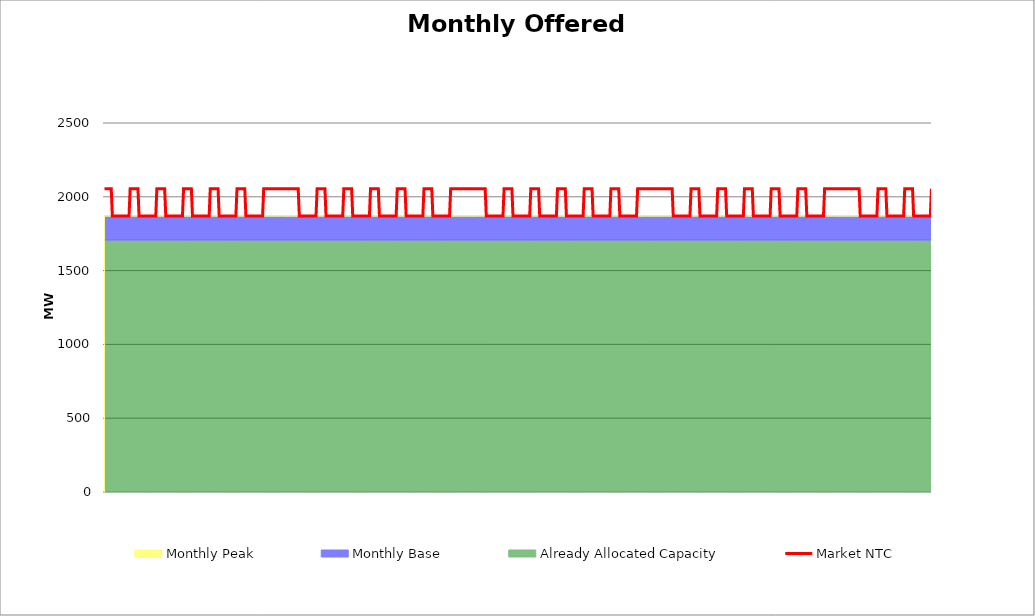
| Category | Market NTC |
|---|---|
| 0 | 2055 |
| 1 | 2055 |
| 2 | 2055 |
| 3 | 2055 |
| 4 | 2055 |
| 5 | 2055 |
| 6 | 2055 |
| 7 | 1870 |
| 8 | 1870 |
| 9 | 1870 |
| 10 | 1870 |
| 11 | 1870 |
| 12 | 1870 |
| 13 | 1870 |
| 14 | 1870 |
| 15 | 1870 |
| 16 | 1870 |
| 17 | 1870 |
| 18 | 1870 |
| 19 | 1870 |
| 20 | 1870 |
| 21 | 1870 |
| 22 | 1870 |
| 23 | 2055 |
| 24 | 2055 |
| 25 | 2055 |
| 26 | 2055 |
| 27 | 2055 |
| 28 | 2055 |
| 29 | 2055 |
| 30 | 2055 |
| 31 | 1870 |
| 32 | 1870 |
| 33 | 1870 |
| 34 | 1870 |
| 35 | 1870 |
| 36 | 1870 |
| 37 | 1870 |
| 38 | 1870 |
| 39 | 1870 |
| 40 | 1870 |
| 41 | 1870 |
| 42 | 1870 |
| 43 | 1870 |
| 44 | 1870 |
| 45 | 1870 |
| 46 | 1870 |
| 47 | 2055 |
| 48 | 2055 |
| 49 | 2055 |
| 50 | 2055 |
| 51 | 2055 |
| 52 | 2055 |
| 53 | 2055 |
| 54 | 2055 |
| 55 | 1870 |
| 56 | 1870 |
| 57 | 1870 |
| 58 | 1870 |
| 59 | 1870 |
| 60 | 1870 |
| 61 | 1870 |
| 62 | 1870 |
| 63 | 1870 |
| 64 | 1870 |
| 65 | 1870 |
| 66 | 1870 |
| 67 | 1870 |
| 68 | 1870 |
| 69 | 1870 |
| 70 | 1870 |
| 71 | 2055 |
| 72 | 2055 |
| 73 | 2055 |
| 74 | 2055 |
| 75 | 2055 |
| 76 | 2055 |
| 77 | 2055 |
| 78 | 2055 |
| 79 | 1870 |
| 80 | 1870 |
| 81 | 1870 |
| 82 | 1870 |
| 83 | 1870 |
| 84 | 1870 |
| 85 | 1870 |
| 86 | 1870 |
| 87 | 1870 |
| 88 | 1870 |
| 89 | 1870 |
| 90 | 1870 |
| 91 | 1870 |
| 92 | 1870 |
| 93 | 1870 |
| 94 | 1870 |
| 95 | 2055 |
| 96 | 2055 |
| 97 | 2055 |
| 98 | 2055 |
| 99 | 2055 |
| 100 | 2055 |
| 101 | 2055 |
| 102 | 2055 |
| 103 | 1870 |
| 104 | 1870 |
| 105 | 1870 |
| 106 | 1870 |
| 107 | 1870 |
| 108 | 1870 |
| 109 | 1870 |
| 110 | 1870 |
| 111 | 1870 |
| 112 | 1870 |
| 113 | 1870 |
| 114 | 1870 |
| 115 | 1870 |
| 116 | 1870 |
| 117 | 1870 |
| 118 | 1870 |
| 119 | 2055 |
| 120 | 2055 |
| 121 | 2055 |
| 122 | 2055 |
| 123 | 2055 |
| 124 | 2055 |
| 125 | 2055 |
| 126 | 2055 |
| 127 | 1870 |
| 128 | 1870 |
| 129 | 1870 |
| 130 | 1870 |
| 131 | 1870 |
| 132 | 1870 |
| 133 | 1870 |
| 134 | 1870 |
| 135 | 1870 |
| 136 | 1870 |
| 137 | 1870 |
| 138 | 1870 |
| 139 | 1870 |
| 140 | 1870 |
| 141 | 1870 |
| 142 | 1870 |
| 143 | 2055 |
| 144 | 2055 |
| 145 | 2055 |
| 146 | 2055 |
| 147 | 2055 |
| 148 | 2055 |
| 149 | 2055 |
| 150 | 2055 |
| 151 | 2055 |
| 152 | 2055 |
| 153 | 2055 |
| 154 | 2055 |
| 155 | 2055 |
| 156 | 2055 |
| 157 | 2055 |
| 158 | 2055 |
| 159 | 2055 |
| 160 | 2055 |
| 161 | 2055 |
| 162 | 2055 |
| 163 | 2055 |
| 164 | 2055 |
| 165 | 2055 |
| 166 | 2055 |
| 167 | 2055 |
| 168 | 2055 |
| 169 | 2055 |
| 170 | 2055 |
| 171 | 2055 |
| 172 | 2055 |
| 173 | 2055 |
| 174 | 2055 |
| 175 | 1870 |
| 176 | 1870 |
| 177 | 1870 |
| 178 | 1870 |
| 179 | 1870 |
| 180 | 1870 |
| 181 | 1870 |
| 182 | 1870 |
| 183 | 1870 |
| 184 | 1870 |
| 185 | 1870 |
| 186 | 1870 |
| 187 | 1870 |
| 188 | 1870 |
| 189 | 1870 |
| 190 | 1870 |
| 191 | 2055 |
| 192 | 2055 |
| 193 | 2055 |
| 194 | 2055 |
| 195 | 2055 |
| 196 | 2055 |
| 197 | 2055 |
| 198 | 2055 |
| 199 | 1870 |
| 200 | 1870 |
| 201 | 1870 |
| 202 | 1870 |
| 203 | 1870 |
| 204 | 1870 |
| 205 | 1870 |
| 206 | 1870 |
| 207 | 1870 |
| 208 | 1870 |
| 209 | 1870 |
| 210 | 1870 |
| 211 | 1870 |
| 212 | 1870 |
| 213 | 1870 |
| 214 | 1870 |
| 215 | 2055 |
| 216 | 2055 |
| 217 | 2055 |
| 218 | 2055 |
| 219 | 2055 |
| 220 | 2055 |
| 221 | 2055 |
| 222 | 2055 |
| 223 | 1870 |
| 224 | 1870 |
| 225 | 1870 |
| 226 | 1870 |
| 227 | 1870 |
| 228 | 1870 |
| 229 | 1870 |
| 230 | 1870 |
| 231 | 1870 |
| 232 | 1870 |
| 233 | 1870 |
| 234 | 1870 |
| 235 | 1870 |
| 236 | 1870 |
| 237 | 1870 |
| 238 | 1870 |
| 239 | 2055 |
| 240 | 2055 |
| 241 | 2055 |
| 242 | 2055 |
| 243 | 2055 |
| 244 | 2055 |
| 245 | 2055 |
| 246 | 2055 |
| 247 | 1870 |
| 248 | 1870 |
| 249 | 1870 |
| 250 | 1870 |
| 251 | 1870 |
| 252 | 1870 |
| 253 | 1870 |
| 254 | 1870 |
| 255 | 1870 |
| 256 | 1870 |
| 257 | 1870 |
| 258 | 1870 |
| 259 | 1870 |
| 260 | 1870 |
| 261 | 1870 |
| 262 | 1870 |
| 263 | 2055 |
| 264 | 2055 |
| 265 | 2055 |
| 266 | 2055 |
| 267 | 2055 |
| 268 | 2055 |
| 269 | 2055 |
| 270 | 2055 |
| 271 | 1870 |
| 272 | 1870 |
| 273 | 1870 |
| 274 | 1870 |
| 275 | 1870 |
| 276 | 1870 |
| 277 | 1870 |
| 278 | 1870 |
| 279 | 1870 |
| 280 | 1870 |
| 281 | 1870 |
| 282 | 1870 |
| 283 | 1870 |
| 284 | 1870 |
| 285 | 1870 |
| 286 | 1870 |
| 287 | 2055 |
| 288 | 2055 |
| 289 | 2055 |
| 290 | 2055 |
| 291 | 2055 |
| 292 | 2055 |
| 293 | 2055 |
| 294 | 2055 |
| 295 | 1870 |
| 296 | 1870 |
| 297 | 1870 |
| 298 | 1870 |
| 299 | 1870 |
| 300 | 1870 |
| 301 | 1870 |
| 302 | 1870 |
| 303 | 1870 |
| 304 | 1870 |
| 305 | 1870 |
| 306 | 1870 |
| 307 | 1870 |
| 308 | 1870 |
| 309 | 1870 |
| 310 | 1870 |
| 311 | 2055 |
| 312 | 2055 |
| 313 | 2055 |
| 314 | 2055 |
| 315 | 2055 |
| 316 | 2055 |
| 317 | 2055 |
| 318 | 2055 |
| 319 | 2055 |
| 320 | 2055 |
| 321 | 2055 |
| 322 | 2055 |
| 323 | 2055 |
| 324 | 2055 |
| 325 | 2055 |
| 326 | 2055 |
| 327 | 2055 |
| 328 | 2055 |
| 329 | 2055 |
| 330 | 2055 |
| 331 | 2055 |
| 332 | 2055 |
| 333 | 2055 |
| 334 | 2055 |
| 335 | 2055 |
| 336 | 2055 |
| 337 | 2055 |
| 338 | 2055 |
| 339 | 2055 |
| 340 | 2055 |
| 341 | 2055 |
| 342 | 2055 |
| 343 | 1870 |
| 344 | 1870 |
| 345 | 1870 |
| 346 | 1870 |
| 347 | 1870 |
| 348 | 1870 |
| 349 | 1870 |
| 350 | 1870 |
| 351 | 1870 |
| 352 | 1870 |
| 353 | 1870 |
| 354 | 1870 |
| 355 | 1870 |
| 356 | 1870 |
| 357 | 1870 |
| 358 | 1870 |
| 359 | 2055 |
| 360 | 2055 |
| 361 | 2055 |
| 362 | 2055 |
| 363 | 2055 |
| 364 | 2055 |
| 365 | 2055 |
| 366 | 2055 |
| 367 | 1870 |
| 368 | 1870 |
| 369 | 1870 |
| 370 | 1870 |
| 371 | 1870 |
| 372 | 1870 |
| 373 | 1870 |
| 374 | 1870 |
| 375 | 1870 |
| 376 | 1870 |
| 377 | 1870 |
| 378 | 1870 |
| 379 | 1870 |
| 380 | 1870 |
| 381 | 1870 |
| 382 | 1870 |
| 383 | 2055 |
| 384 | 2055 |
| 385 | 2055 |
| 386 | 2055 |
| 387 | 2055 |
| 388 | 2055 |
| 389 | 2055 |
| 390 | 2055 |
| 391 | 1870 |
| 392 | 1870 |
| 393 | 1870 |
| 394 | 1870 |
| 395 | 1870 |
| 396 | 1870 |
| 397 | 1870 |
| 398 | 1870 |
| 399 | 1870 |
| 400 | 1870 |
| 401 | 1870 |
| 402 | 1870 |
| 403 | 1870 |
| 404 | 1870 |
| 405 | 1870 |
| 406 | 1870 |
| 407 | 2055 |
| 408 | 2055 |
| 409 | 2055 |
| 410 | 2055 |
| 411 | 2055 |
| 412 | 2055 |
| 413 | 2055 |
| 414 | 2055 |
| 415 | 1870 |
| 416 | 1870 |
| 417 | 1870 |
| 418 | 1870 |
| 419 | 1870 |
| 420 | 1870 |
| 421 | 1870 |
| 422 | 1870 |
| 423 | 1870 |
| 424 | 1870 |
| 425 | 1870 |
| 426 | 1870 |
| 427 | 1870 |
| 428 | 1870 |
| 429 | 1870 |
| 430 | 1870 |
| 431 | 2055 |
| 432 | 2055 |
| 433 | 2055 |
| 434 | 2055 |
| 435 | 2055 |
| 436 | 2055 |
| 437 | 2055 |
| 438 | 2055 |
| 439 | 1870 |
| 440 | 1870 |
| 441 | 1870 |
| 442 | 1870 |
| 443 | 1870 |
| 444 | 1870 |
| 445 | 1870 |
| 446 | 1870 |
| 447 | 1870 |
| 448 | 1870 |
| 449 | 1870 |
| 450 | 1870 |
| 451 | 1870 |
| 452 | 1870 |
| 453 | 1870 |
| 454 | 1870 |
| 455 | 2055 |
| 456 | 2055 |
| 457 | 2055 |
| 458 | 2055 |
| 459 | 2055 |
| 460 | 2055 |
| 461 | 2055 |
| 462 | 2055 |
| 463 | 1870 |
| 464 | 1870 |
| 465 | 1870 |
| 466 | 1870 |
| 467 | 1870 |
| 468 | 1870 |
| 469 | 1870 |
| 470 | 1870 |
| 471 | 1870 |
| 472 | 1870 |
| 473 | 1870 |
| 474 | 1870 |
| 475 | 1870 |
| 476 | 1870 |
| 477 | 1870 |
| 478 | 1870 |
| 479 | 2055 |
| 480 | 2055 |
| 481 | 2055 |
| 482 | 2055 |
| 483 | 2055 |
| 484 | 2055 |
| 485 | 2055 |
| 486 | 2055 |
| 487 | 2055 |
| 488 | 2055 |
| 489 | 2055 |
| 490 | 2055 |
| 491 | 2055 |
| 492 | 2055 |
| 493 | 2055 |
| 494 | 2055 |
| 495 | 2055 |
| 496 | 2055 |
| 497 | 2055 |
| 498 | 2055 |
| 499 | 2055 |
| 500 | 2055 |
| 501 | 2055 |
| 502 | 2055 |
| 503 | 2055 |
| 504 | 2055 |
| 505 | 2055 |
| 506 | 2055 |
| 507 | 2055 |
| 508 | 2055 |
| 509 | 2055 |
| 510 | 2055 |
| 511 | 1870 |
| 512 | 1870 |
| 513 | 1870 |
| 514 | 1870 |
| 515 | 1870 |
| 516 | 1870 |
| 517 | 1870 |
| 518 | 1870 |
| 519 | 1870 |
| 520 | 1870 |
| 521 | 1870 |
| 522 | 1870 |
| 523 | 1870 |
| 524 | 1870 |
| 525 | 1870 |
| 526 | 1870 |
| 527 | 2055 |
| 528 | 2055 |
| 529 | 2055 |
| 530 | 2055 |
| 531 | 2055 |
| 532 | 2055 |
| 533 | 2055 |
| 534 | 2055 |
| 535 | 1870 |
| 536 | 1870 |
| 537 | 1870 |
| 538 | 1870 |
| 539 | 1870 |
| 540 | 1870 |
| 541 | 1870 |
| 542 | 1870 |
| 543 | 1870 |
| 544 | 1870 |
| 545 | 1870 |
| 546 | 1870 |
| 547 | 1870 |
| 548 | 1870 |
| 549 | 1870 |
| 550 | 1870 |
| 551 | 2055 |
| 552 | 2055 |
| 553 | 2055 |
| 554 | 2055 |
| 555 | 2055 |
| 556 | 2055 |
| 557 | 2055 |
| 558 | 2055 |
| 559 | 1870 |
| 560 | 1870 |
| 561 | 1870 |
| 562 | 1870 |
| 563 | 1870 |
| 564 | 1870 |
| 565 | 1870 |
| 566 | 1870 |
| 567 | 1870 |
| 568 | 1870 |
| 569 | 1870 |
| 570 | 1870 |
| 571 | 1870 |
| 572 | 1870 |
| 573 | 1870 |
| 574 | 1870 |
| 575 | 2055 |
| 576 | 2055 |
| 577 | 2055 |
| 578 | 2055 |
| 579 | 2055 |
| 580 | 2055 |
| 581 | 2055 |
| 582 | 2055 |
| 583 | 1870 |
| 584 | 1870 |
| 585 | 1870 |
| 586 | 1870 |
| 587 | 1870 |
| 588 | 1870 |
| 589 | 1870 |
| 590 | 1870 |
| 591 | 1870 |
| 592 | 1870 |
| 593 | 1870 |
| 594 | 1870 |
| 595 | 1870 |
| 596 | 1870 |
| 597 | 1870 |
| 598 | 1870 |
| 599 | 2055 |
| 600 | 2055 |
| 601 | 2055 |
| 602 | 2055 |
| 603 | 2055 |
| 604 | 2055 |
| 605 | 2055 |
| 606 | 2055 |
| 607 | 1870 |
| 608 | 1870 |
| 609 | 1870 |
| 610 | 1870 |
| 611 | 1870 |
| 612 | 1870 |
| 613 | 1870 |
| 614 | 1870 |
| 615 | 1870 |
| 616 | 1870 |
| 617 | 1870 |
| 618 | 1870 |
| 619 | 1870 |
| 620 | 1870 |
| 621 | 1870 |
| 622 | 1870 |
| 623 | 2055 |
| 624 | 2055 |
| 625 | 2055 |
| 626 | 2055 |
| 627 | 2055 |
| 628 | 2055 |
| 629 | 2055 |
| 630 | 2055 |
| 631 | 1870 |
| 632 | 1870 |
| 633 | 1870 |
| 634 | 1870 |
| 635 | 1870 |
| 636 | 1870 |
| 637 | 1870 |
| 638 | 1870 |
| 639 | 1870 |
| 640 | 1870 |
| 641 | 1870 |
| 642 | 1870 |
| 643 | 1870 |
| 644 | 1870 |
| 645 | 1870 |
| 646 | 1870 |
| 647 | 2055 |
| 648 | 2055 |
| 649 | 2055 |
| 650 | 2055 |
| 651 | 2055 |
| 652 | 2055 |
| 653 | 2055 |
| 654 | 2055 |
| 655 | 2055 |
| 656 | 2055 |
| 657 | 2055 |
| 658 | 2055 |
| 659 | 2055 |
| 660 | 2055 |
| 661 | 2055 |
| 662 | 2055 |
| 663 | 2055 |
| 664 | 2055 |
| 665 | 2055 |
| 666 | 2055 |
| 667 | 2055 |
| 668 | 2055 |
| 669 | 2055 |
| 670 | 2055 |
| 671 | 2055 |
| 672 | 2055 |
| 673 | 2055 |
| 674 | 2055 |
| 675 | 2055 |
| 676 | 2055 |
| 677 | 2055 |
| 678 | 2055 |
| 679 | 1870 |
| 680 | 1870 |
| 681 | 1870 |
| 682 | 1870 |
| 683 | 1870 |
| 684 | 1870 |
| 685 | 1870 |
| 686 | 1870 |
| 687 | 1870 |
| 688 | 1870 |
| 689 | 1870 |
| 690 | 1870 |
| 691 | 1870 |
| 692 | 1870 |
| 693 | 1870 |
| 694 | 1870 |
| 695 | 2055 |
| 696 | 2055 |
| 697 | 2055 |
| 698 | 2055 |
| 699 | 2055 |
| 700 | 2055 |
| 701 | 2055 |
| 702 | 2055 |
| 703 | 1870 |
| 704 | 1870 |
| 705 | 1870 |
| 706 | 1870 |
| 707 | 1870 |
| 708 | 1870 |
| 709 | 1870 |
| 710 | 1870 |
| 711 | 1870 |
| 712 | 1870 |
| 713 | 1870 |
| 714 | 1870 |
| 715 | 1870 |
| 716 | 1870 |
| 717 | 1870 |
| 718 | 1870 |
| 719 | 2055 |
| 720 | 2055 |
| 721 | 2055 |
| 722 | 2055 |
| 723 | 2055 |
| 724 | 2055 |
| 725 | 2055 |
| 726 | 2055 |
| 727 | 1870 |
| 728 | 1870 |
| 729 | 1870 |
| 730 | 1870 |
| 731 | 1870 |
| 732 | 1870 |
| 733 | 1870 |
| 734 | 1870 |
| 735 | 1870 |
| 736 | 1870 |
| 737 | 1870 |
| 738 | 1870 |
| 739 | 1870 |
| 740 | 1870 |
| 741 | 1870 |
| 742 | 1870 |
| 743 | 2055 |